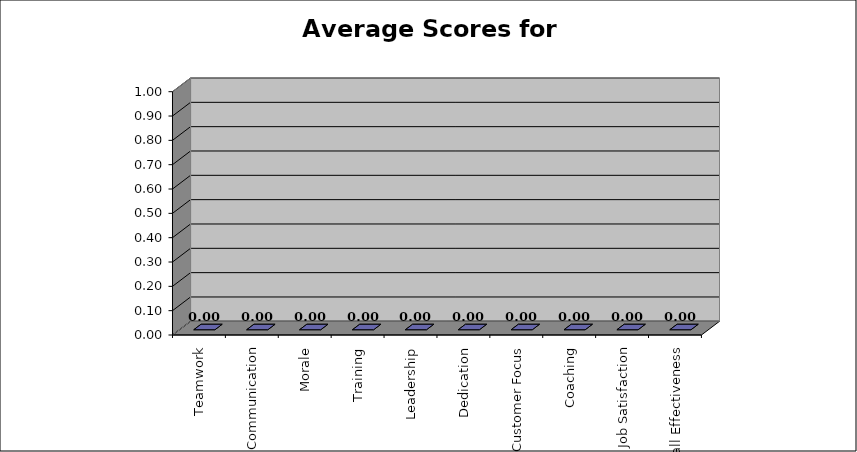
| Category | Series 0 |
|---|---|
| Teamwork | 0 |
| Communication | 0 |
| Morale | 0 |
| Training | 0 |
| Leadership | 0 |
| Dedication | 0 |
| Customer Focus | 0 |
| Coaching | 0 |
| Job Satisfaction | 0 |
| Overall Effectiveness | 0 |